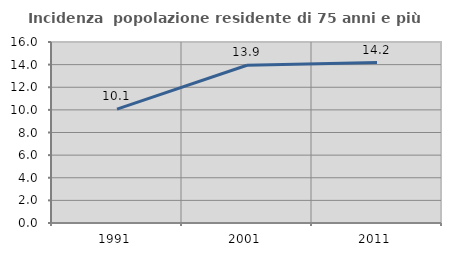
| Category | Incidenza  popolazione residente di 75 anni e più |
|---|---|
| 1991.0 | 10.066 |
| 2001.0 | 13.948 |
| 2011.0 | 14.182 |